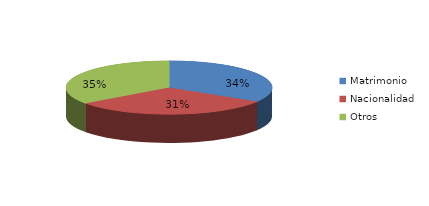
| Category | Series 0 |
|---|---|
| Matrimonio | 1879 |
| Nacionalidad | 1738 |
| Otros | 1956 |